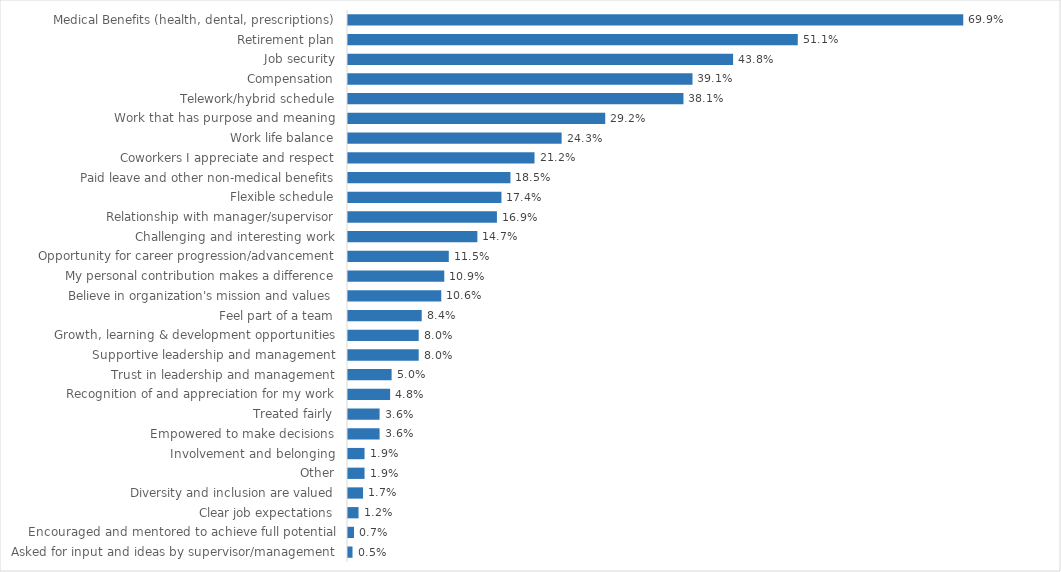
| Category | Children & Families |
|---|---|
| Medical Benefits (health, dental, prescriptions) | 0.699 |
| Retirement plan | 0.511 |
| Job security | 0.438 |
| Compensation | 0.391 |
| Telework/hybrid schedule | 0.381 |
| Work that has purpose and meaning | 0.292 |
| Work life balance | 0.243 |
| Coworkers I appreciate and respect | 0.212 |
| Paid leave and other non-medical benefits | 0.185 |
| Flexible schedule | 0.174 |
| Relationship with manager/supervisor | 0.169 |
| Challenging and interesting work | 0.147 |
| Opportunity for career progression/advancement | 0.115 |
| My personal contribution makes a difference | 0.109 |
| Believe in organization's mission and values | 0.106 |
| Feel part of a team | 0.084 |
| Growth, learning & development opportunities | 0.08 |
| Supportive leadership and management | 0.08 |
| Trust in leadership and management | 0.05 |
| Recognition of and appreciation for my work | 0.048 |
| Treated fairly | 0.036 |
| Empowered to make decisions | 0.036 |
| Involvement and belonging | 0.019 |
| Other | 0.019 |
| Diversity and inclusion are valued | 0.017 |
| Clear job expectations | 0.012 |
| Encouraged and mentored to achieve full potential | 0.007 |
| Asked for input and ideas by supervisor/management | 0.005 |